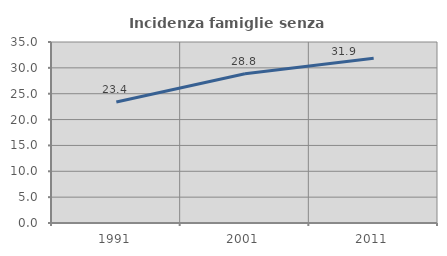
| Category | Incidenza famiglie senza nuclei |
|---|---|
| 1991.0 | 23.4 |
| 2001.0 | 28.847 |
| 2011.0 | 31.871 |